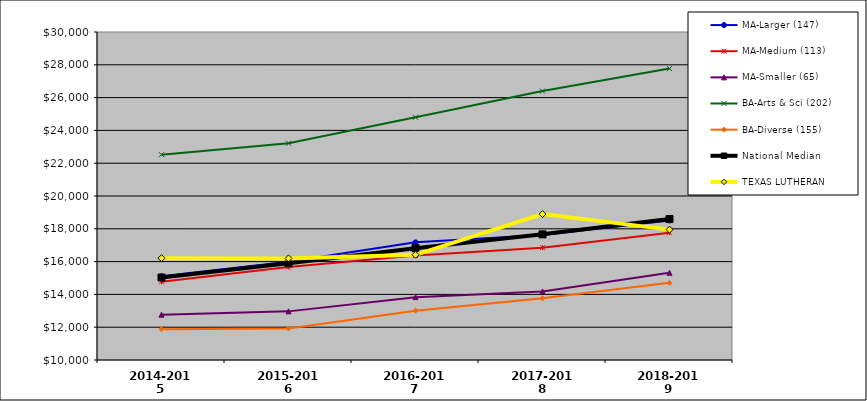
| Category | MA-Larger (147) | MA-Medium (113) | MA-Smaller (65) | BA-Arts & Sci (202) | BA-Diverse (155) | National Median | TEXAS LUTHERAN |
|---|---|---|---|---|---|---|---|
| 2014-2015 | 15105 | 14766 | 12763 | 22519 | 11880 | 15026.5 | 16208 |
| 2015-2016 | 15991 | 15670 | 12965 | 23215.5 | 11922 | 15904.5 | 16193 |
| 2016-2017 | 17174 | 16379 | 13833 | 24799 | 13010 | 16820.5 | 16415 |
| 2017-2018 | 17626 | 16850 | 14182 | 26397 | 13761 | 17661 | 18895 |
| 2018-2019 | 18511 | 17762 | 15316 | 27769.5 | 14705 | 18596 | 17949 |